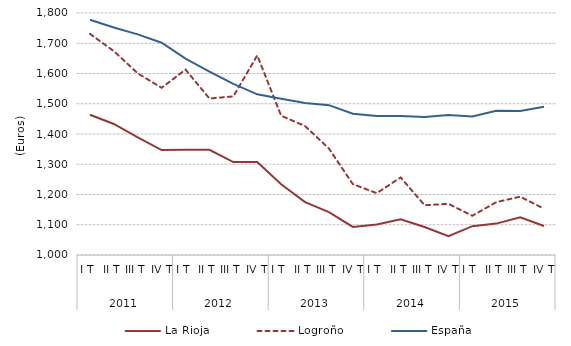
| Category | La Rioja | Logroño | España |
|---|---|---|---|
| 0 | 1463.8 | 1731 | 1777.6 |
| 1 | 1433.1 | 1674 | 1752.1 |
| 2 | 1388.7 | 1600.4 | 1729.3 |
| 3 | 1347 | 1552.8 | 1701.8 |
| 4 | 1347.7 | 1612.8 | 1649.3 |
| 5 | 1347.7 | 1517.3 | 1606.4 |
| 6 | 1307.2 | 1524.3 | 1565.6 |
| 7 | 1307.2 | 1659.8 | 1531.2 |
| 8 | 1234 | 1460.4 | 1516.4 |
| 9 | 1174.8 | 1426.2 | 1502.8 |
| 10 | 1141.9 | 1351.9 | 1495.3 |
| 11 | 1092.8 | 1234.2 | 1466.9 |
| 12 | 1100.6 | 1204.4 | 1459.4 |
| 13 | 1118 | 1256.4 | 1459.3 |
| 14 | 1092.4 | 1164.6 | 1455.8 |
| 15 | 1061.9 | 1169.1 | 1463.1 |
| 16 | 1095.4 | 1129.7 | 1457.9 |
| 17 | 1103.8 | 1174.6 | 1476.8 |
| 18 | 1124.3 | 1192.9 | 1476 |
| 19 | 1096 | 1152.9 | 1490.1 |